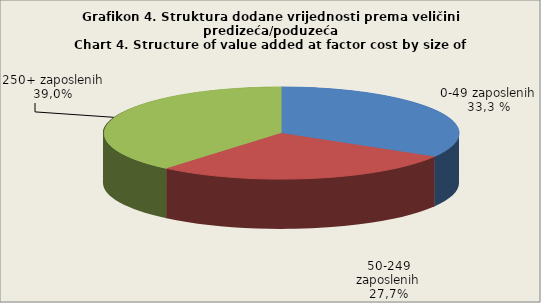
| Category | Broj zaposlenih osoba
Number of persons employed
  |
|---|---|
| 0-49 zaposlenih | 33.496 |
| 50-249 zaposlenih | 27.614 |
| 250+ zaposlenih | 38.89 |